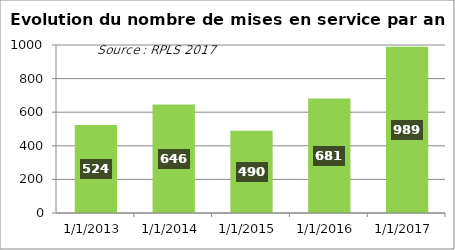
| Category | Series 0 |
|---|---|
| 2013-01-01 | 524 |
| 2014-01-01 | 646 |
| 2015-01-01 | 490 |
| 2016-01-01 | 681 |
| 2017-01-01 | 989 |